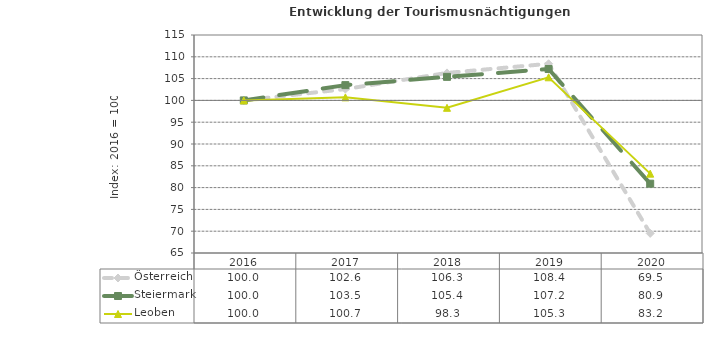
| Category | Österreich | Steiermark | Leoben |
|---|---|---|---|
| 2020.0 | 69.5 | 80.9 | 83.2 |
| 2019.0 | 108.4 | 107.2 | 105.3 |
| 2018.0 | 106.3 | 105.4 | 98.3 |
| 2017.0 | 102.6 | 103.5 | 100.7 |
| 2016.0 | 100 | 100 | 100 |